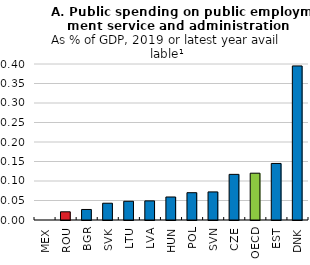
| Category | Series 0 |
|---|---|
| MEX | 0 |
| ROU | 0.021 |
| BGR | 0.027 |
| SVK | 0.043 |
| LTU | 0.048 |
| LVA | 0.049 |
| HUN | 0.059 |
| POL | 0.07 |
| SVN | 0.072 |
| CZE | 0.117 |
| OECD | 0.12 |
| EST | 0.145 |
| DNK | 0.395 |